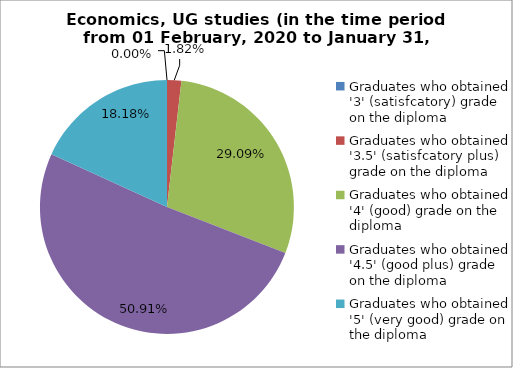
| Category | Series 0 |
|---|---|
| Graduates who obtained '3' (satisfcatory) grade on the diploma | 0 |
| Graduates who obtained '3.5' (satisfcatory plus) grade on the diploma | 1.818 |
| Graduates who obtained '4' (good) grade on the diploma | 29.091 |
| Graduates who obtained '4.5' (good plus) grade on the diploma | 50.909 |
| Graduates who obtained '5' (very good) grade on the diploma | 18.182 |